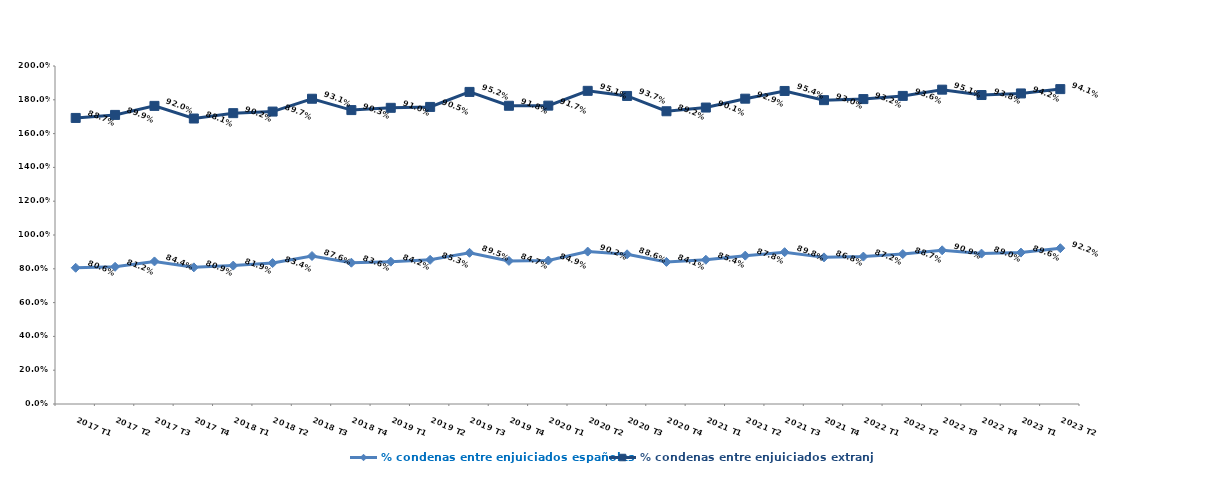
| Category | % condenas entre enjuiciados españoles | % condenas entre enjuiciados extranjeros |
|---|---|---|
| 2017 T1 | 0.806 | 0.887 |
| 2017 T2 | 0.812 | 0.899 |
| 2017 T3 | 0.844 | 0.92 |
| 2017 T4 | 0.809 | 0.881 |
| 2018 T1 | 0.819 | 0.902 |
| 2018 T2 | 0.834 | 0.897 |
| 2018 T3 | 0.876 | 0.931 |
| 2018 T4 | 0.836 | 0.903 |
| 2019 T1 | 0.842 | 0.91 |
| 2019 T2 | 0.853 | 0.905 |
| 2019 T3 | 0.895 | 0.952 |
| 2019 T4 | 0.847 | 0.918 |
| 2020 T1 | 0.849 | 0.917 |
| 2020 T2 | 0.902 | 0.951 |
| 2020 T3 | 0.886 | 0.937 |
| 2020 T4 | 0.841 | 0.892 |
| 2021 T1 | 0.854 | 0.901 |
| 2021 T2 | 0.878 | 0.929 |
| 2021 T3 | 0.898 | 0.954 |
| 2021 T4 | 0.868 | 0.93 |
| 2022 T1 | 0.872 | 0.932 |
| 2022 T2 | 0.887 | 0.936 |
| 2022 T3 | 0.909 | 0.951 |
| 2022 T4 | 0.89 | 0.938 |
| 2023 T1 | 0.896 | 0.942 |
| 2023 T2 | 0.922 | 0.941 |